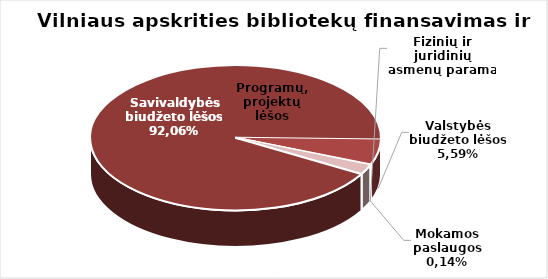
| Category | Series 0 |
|---|---|
| Savivaldybės biudžeto lėšos | 7327805 |
| Valstybės biudžeto lėšos | 444677 |
| Mokamos paslaugos | 11339 |
| Fizinių ir juridinių asmenų parama | 4272.4 |
| Programų, projektų lėšos | 171727 |